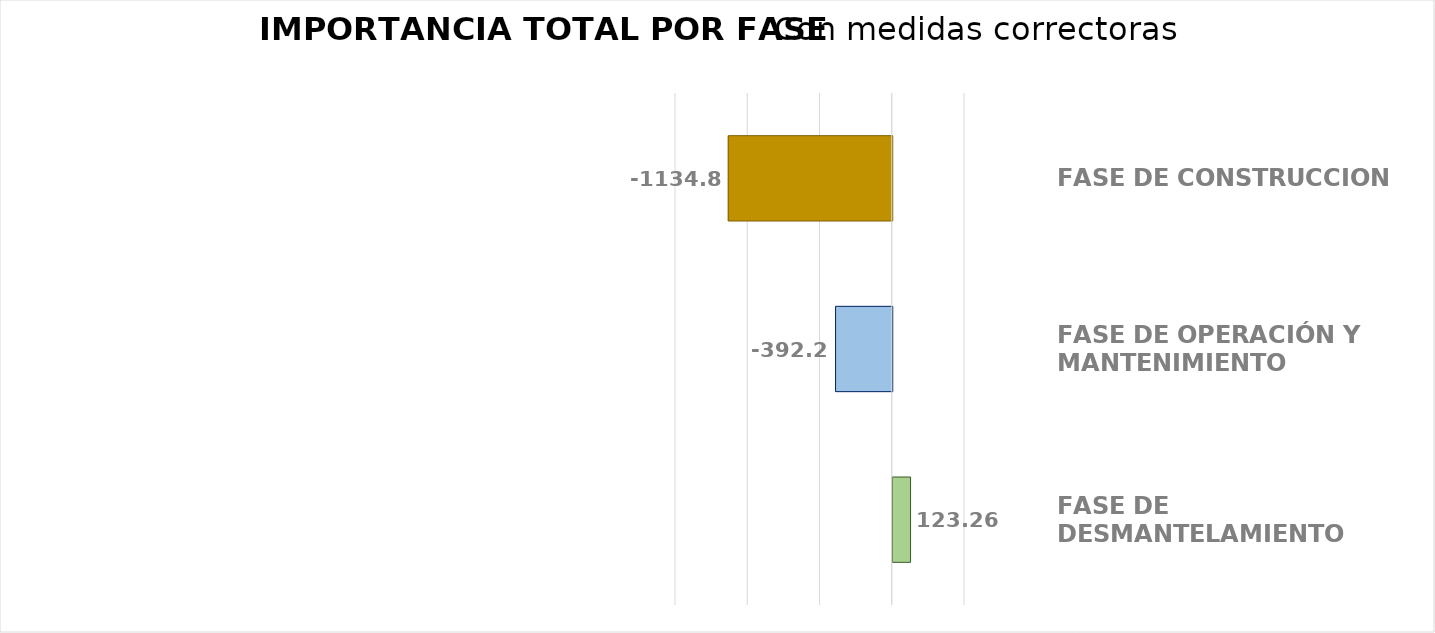
| Category | Series 0 |
|---|---|
| FASE DE CONSTRUCCION | -1134.83 |
| FASE DE OPERACIÓN Y MANTENIMIENTO | -392.257 |
| FASE DE DESMANTELAMIENTO | 123.258 |